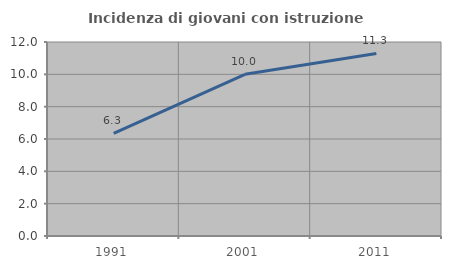
| Category | Incidenza di giovani con istruzione universitaria |
|---|---|
| 1991.0 | 6.349 |
| 2001.0 | 10 |
| 2011.0 | 11.29 |